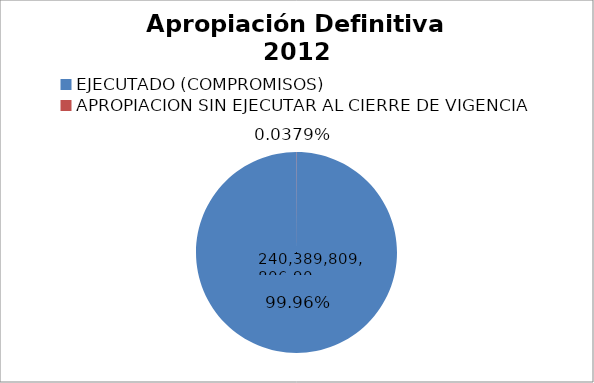
| Category | Apropiación Definitiva 2012 |
|---|---|
| EJECUTADO (COMPROMISOS) | 240389809806.9 |
| APROPIACION SIN EJECUTAR AL CIERRE DE VIGENCIA | 91057993.1 |